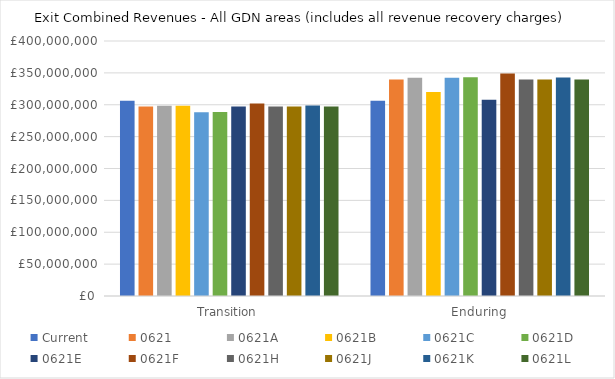
| Category | Current | 0621 | 0621A | 0621B | 0621C | 0621D | 0621E | 0621F | 0621H | 0621J | 0621K | 0621L |
|---|---|---|---|---|---|---|---|---|---|---|---|---|
| Transition | 306170917.247 | 297341428.523 | 298583579.533 | 298583579.533 | 288350907.401 | 288447483.22 | 297341428.523 | 301949894.573 | 297341428.523 | 297082331.875 | 298832162.078 | 297341428.523 |
| Enduring | 306170917.247 | 339721241.882 | 342344779.797 | 319857363.582 | 342344779.797 | 343193215.844 | 307870548.551 | 349128926.478 | 339721241.882 | 339737721.382 | 342874682.695 | 339487254.542 |